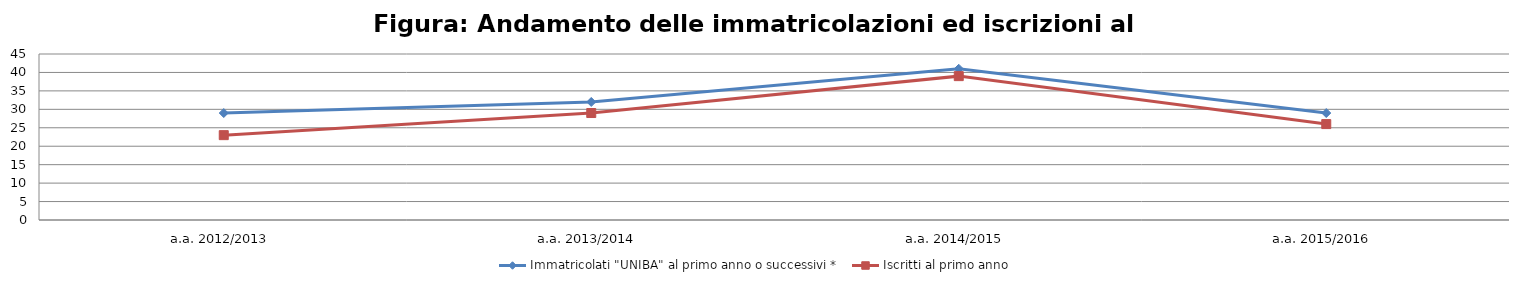
| Category | Immatricolati "UNIBA" al primo anno o successivi * | Iscritti al primo anno  |
|---|---|---|
| a.a. 2012/2013 | 29 | 23 |
| a.a. 2013/2014 | 32 | 29 |
| a.a. 2014/2015 | 41 | 39 |
| a.a. 2015/2016 | 29 | 26 |